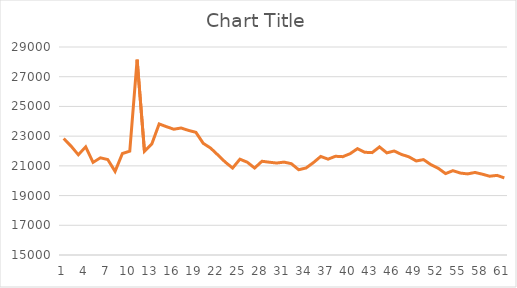
| Category | Series 0 |
|---|---|
| 0 | 22839.8 |
| 1 | 22330.8 |
| 2 | 21741.5 |
| 3 | 22280 |
| 4 | 21231.2 |
| 5 | 21538.9 |
| 6 | 21428.4 |
| 7 | 20629.6 |
| 8 | 21834.1 |
| 9 | 21991.8 |
| 10 | 28148.1 |
| 11 | 21982.2 |
| 12 | 22472.5 |
| 13 | 23821.7 |
| 14 | 23635 |
| 15 | 23465.9 |
| 16 | 23548 |
| 17 | 23385.2 |
| 18 | 23258.2 |
| 19 | 22516.6 |
| 20 | 22198.7 |
| 21 | 21732.3 |
| 22 | 21254.3 |
| 23 | 20852.2 |
| 24 | 21448.8 |
| 25 | 21244.6 |
| 26 | 20853.5 |
| 27 | 21309.7 |
| 28 | 21244.5 |
| 29 | 21190.4 |
| 30 | 21251.9 |
| 31 | 21146.3 |
| 32 | 20738.5 |
| 33 | 20857.2 |
| 34 | 21216.6 |
| 35 | 21632.9 |
| 36 | 21452 |
| 37 | 21644.4 |
| 38 | 21618.6 |
| 39 | 21817.6 |
| 40 | 22156.8 |
| 41 | 21913.8 |
| 42 | 21891.3 |
| 43 | 22275.4 |
| 44 | 21873.3 |
| 45 | 22001 |
| 46 | 21766.3 |
| 47 | 21610.6 |
| 48 | 21329.9 |
| 49 | 21419.5 |
| 50 | 21080.6 |
| 51 | 20836.7 |
| 52 | 20479.3 |
| 53 | 20676.6 |
| 54 | 20516 |
| 55 | 20458.6 |
| 56 | 20556.2 |
| 57 | 20440.4 |
| 58 | 20302.3 |
| 59 | 20358.7 |
| 60 | 20190.8 |